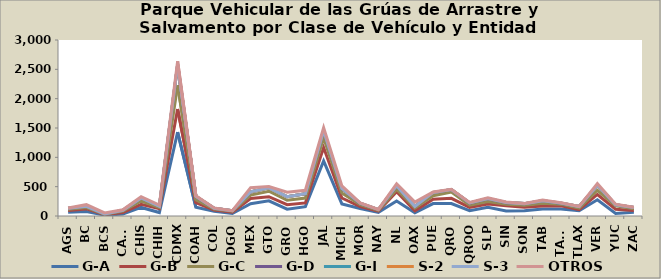
| Category | G-A | G-B | G-C | G-D | G-I | S-2 | S-3 | OTROS |
|---|---|---|---|---|---|---|---|---|
| AGS | 65 | 28 | 23 | 14 | 1 | 0 | 0 | 6 |
| BC | 75 | 46 | 24 | 20 | 0 | 1 | 0 | 27 |
| BCS | 15 | 9 | 7 | 4 | 1 | 0 | 0 | 17 |
| CAMP | 32 | 27 | 24 | 13 | 1 | 0 | 0 | 8 |
| CHIS | 146 | 52 | 57 | 52 | 0 | 0 | 0 | 22 |
| CHIH | 59 | 66 | 20 | 22 | 0 | 0 | 0 | 18 |
| CDMX | 1431 | 392 | 406 | 345 | 6 | 1 | 0 | 58 |
| COAH | 149 | 79 | 49 | 52 | 6 | 0 | 0 | 9 |
| COL | 81 | 21 | 18 | 11 | 0 | 1 | 0 | 6 |
| DGO | 42 | 21 | 21 | 5 | 0 | 0 | 0 | 2 |
| MEX | 208 | 90 | 59 | 53 | 3 | 0 | 0 | 70 |
| GTO | 258 | 71 | 93 | 57 | 1 | 0 | 0 | 22 |
| GRO | 116 | 77 | 75 | 60 | 1 | 0 | 0 | 77 |
| HGO | 160 | 63 | 83 | 72 | 1 | 0 | 0 | 60 |
| JAL | 938 | 228 | 167 | 120 | 4 | 1 | 0 | 48 |
| MICH | 206 | 101 | 84 | 75 | 0 | 3 | 0 | 43 |
| MOR | 127 | 35 | 34 | 20 | 1 | 0 | 0 | 7 |
| NAY | 62 | 22 | 15 | 11 | 0 | 0 | 0 | 2 |
| NL | 256 | 158 | 43 | 54 | 6 | 0 | 0 | 33 |
| OAX | 57 | 32 | 47 | 27 | 0 | 0 | 0 | 74 |
| PUE | 211 | 75 | 60 | 52 | 1 | 1 | 2 | 6 |
| QRO | 211 | 90 | 108 | 41 | 0 | 0 | 0 | 5 |
| QROO | 90 | 58 | 37 | 36 | 1 | 0 | 0 | 9 |
| SLP | 147 | 56 | 42 | 50 | 1 | 0 | 0 | 15 |
| SIN | 87 | 86 | 26 | 26 | 5 | 0 | 1 | 7 |
| SON | 91 | 57 | 36 | 27 | 0 | 0 | 0 | 3 |
| TAB | 121 | 49 | 47 | 43 | 0 | 0 | 0 | 12 |
| TAMS | 119 | 55 | 28 | 16 | 1 | 1 | 0 | 5 |
| TLAX | 89 | 20 | 26 | 26 | 0 | 0 | 0 | 3 |
| VER | 277 | 90 | 72 | 84 | 0 | 1 | 0 | 27 |
| YUC | 43 | 73 | 56 | 18 | 0 | 0 | 0 | 12 |
| ZAC | 63 | 31 | 29 | 21 | 0 | 2 | 0 | 3 |